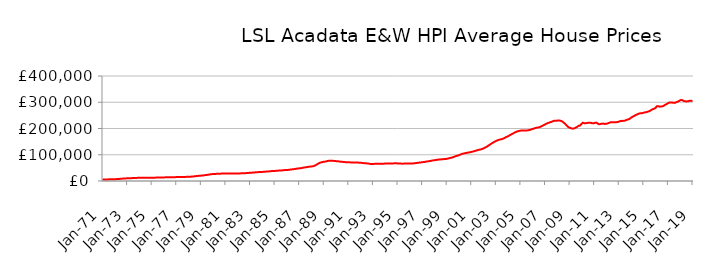
| Category | Series 0 |
|---|---|
| 1971-01-01 | 5778.581 |
| 1971-02-01 | 5819.644 |
| 1971-03-01 | 5861.052 |
| 1971-04-01 | 5914.887 |
| 1971-05-01 | 6004.226 |
| 1971-06-01 | 6097.324 |
| 1971-07-01 | 6211.806 |
| 1971-08-01 | 6336.376 |
| 1971-09-01 | 6459.952 |
| 1971-10-01 | 6588.334 |
| 1971-11-01 | 6726.925 |
| 1971-12-01 | 6895.683 |
| 1972-01-01 | 7012.816 |
| 1972-02-01 | 7089.505 |
| 1972-03-01 | 7264.068 |
| 1972-04-01 | 7508.171 |
| 1972-05-01 | 7860.864 |
| 1972-06-01 | 8170.355 |
| 1972-07-01 | 8526.19 |
| 1972-08-01 | 8869.45 |
| 1972-09-01 | 9172.546 |
| 1972-10-01 | 9455.81 |
| 1972-11-01 | 9718.109 |
| 1972-12-01 | 9988.703 |
| 1973-01-01 | 10182.281 |
| 1973-02-01 | 10319.059 |
| 1973-03-01 | 10476.299 |
| 1973-04-01 | 10655.658 |
| 1973-05-01 | 10885.617 |
| 1973-06-01 | 11035.023 |
| 1973-07-01 | 11191.497 |
| 1973-08-01 | 11365.076 |
| 1973-09-01 | 11567.646 |
| 1973-10-01 | 11777.671 |
| 1973-11-01 | 11937.725 |
| 1973-12-01 | 12052.498 |
| 1974-01-01 | 12114.056 |
| 1974-02-01 | 12180.401 |
| 1974-03-01 | 12177.683 |
| 1974-04-01 | 12151.396 |
| 1974-05-01 | 12128.2 |
| 1974-06-01 | 12129.044 |
| 1974-07-01 | 12140.839 |
| 1974-08-01 | 12180.432 |
| 1974-09-01 | 12252.457 |
| 1974-10-01 | 12340.928 |
| 1974-11-01 | 12414.246 |
| 1974-12-01 | 12486.63 |
| 1975-01-01 | 12520.118 |
| 1975-02-01 | 12562.362 |
| 1975-03-01 | 12637.333 |
| 1975-04-01 | 12744.087 |
| 1975-05-01 | 12873.689 |
| 1975-06-01 | 12943.075 |
| 1975-07-01 | 13011.113 |
| 1975-08-01 | 13105.055 |
| 1975-09-01 | 13232.189 |
| 1975-10-01 | 13373.438 |
| 1975-11-01 | 13497.805 |
| 1975-12-01 | 13630.81 |
| 1976-01-01 | 13724.455 |
| 1976-02-01 | 13812.644 |
| 1976-03-01 | 13872.986 |
| 1976-04-01 | 13937.169 |
| 1976-05-01 | 14021.143 |
| 1976-06-01 | 14076.084 |
| 1976-07-01 | 14136.858 |
| 1976-08-01 | 14226.8 |
| 1976-09-01 | 14355.517 |
| 1976-10-01 | 14500.583 |
| 1976-11-01 | 14616.658 |
| 1976-12-01 | 14720.316 |
| 1977-01-01 | 14777.952 |
| 1977-02-01 | 14844.144 |
| 1977-03-01 | 14887.065 |
| 1977-04-01 | 14937.409 |
| 1977-05-01 | 15015.166 |
| 1977-06-01 | 15085.676 |
| 1977-07-01 | 15172.371 |
| 1977-08-01 | 15291.274 |
| 1977-09-01 | 15436.686 |
| 1977-10-01 | 15600.493 |
| 1977-11-01 | 15773.788 |
| 1977-12-01 | 15999.984 |
| 1978-01-01 | 16167.959 |
| 1978-02-01 | 16299.061 |
| 1978-03-01 | 16475.734 |
| 1978-04-01 | 16713.402 |
| 1978-05-01 | 17094.413 |
| 1978-06-01 | 17479.975 |
| 1978-07-01 | 17946.292 |
| 1978-08-01 | 18424.608 |
| 1978-09-01 | 18884.941 |
| 1978-10-01 | 19342.68 |
| 1978-11-01 | 19769.516 |
| 1978-12-01 | 20191.255 |
| 1979-01-01 | 20442.13 |
| 1979-02-01 | 20610.397 |
| 1979-03-01 | 21029.54 |
| 1979-04-01 | 21604.081 |
| 1979-05-01 | 22337.281 |
| 1979-06-01 | 22802.563 |
| 1979-07-01 | 23285.495 |
| 1979-08-01 | 23829.32 |
| 1979-09-01 | 24480.85 |
| 1979-10-01 | 25176.324 |
| 1979-11-01 | 25755.381 |
| 1979-12-01 | 26205.315 |
| 1980-01-01 | 26452.337 |
| 1980-02-01 | 26644.34 |
| 1980-03-01 | 26890.696 |
| 1980-04-01 | 27179.161 |
| 1980-05-01 | 27516.6 |
| 1980-06-01 | 27697.106 |
| 1980-07-01 | 27860.786 |
| 1980-08-01 | 28012.05 |
| 1980-09-01 | 28118.706 |
| 1980-10-01 | 28187.005 |
| 1980-11-01 | 28239.499 |
| 1980-12-01 | 28351.177 |
| 1981-01-01 | 28417.565 |
| 1981-02-01 | 28518.272 |
| 1981-03-01 | 28619.251 |
| 1981-04-01 | 28754.782 |
| 1981-05-01 | 28892.195 |
| 1981-06-01 | 28938.816 |
| 1981-07-01 | 28961.048 |
| 1981-08-01 | 28966.541 |
| 1981-09-01 | 28911.984 |
| 1981-10-01 | 28812.42 |
| 1981-11-01 | 28721.014 |
| 1981-12-01 | 28711.063 |
| 1982-01-01 | 28666.699 |
| 1982-02-01 | 28686.129 |
| 1982-03-01 | 28845.213 |
| 1982-04-01 | 29113.24 |
| 1982-05-01 | 29413.475 |
| 1982-06-01 | 29523.039 |
| 1982-07-01 | 29605.704 |
| 1982-08-01 | 29763.338 |
| 1982-09-01 | 30018.943 |
| 1982-10-01 | 30322.622 |
| 1982-11-01 | 30625.169 |
| 1982-12-01 | 31000.37 |
| 1983-01-01 | 31285.472 |
| 1983-02-01 | 31530.496 |
| 1983-03-01 | 31785.806 |
| 1983-04-01 | 32102.207 |
| 1983-05-01 | 32517.182 |
| 1983-06-01 | 32842.832 |
| 1983-07-01 | 33197.41 |
| 1983-08-01 | 33534.274 |
| 1983-09-01 | 33803.554 |
| 1983-10-01 | 34023.857 |
| 1983-11-01 | 34231.746 |
| 1983-12-01 | 34504.784 |
| 1984-01-01 | 34667.972 |
| 1984-02-01 | 34833.654 |
| 1984-03-01 | 35148.221 |
| 1984-04-01 | 35584.586 |
| 1984-05-01 | 36084.097 |
| 1984-06-01 | 36305.56 |
| 1984-07-01 | 36490.904 |
| 1984-08-01 | 36773.294 |
| 1984-09-01 | 37223.913 |
| 1984-10-01 | 37745.264 |
| 1984-11-01 | 38148.207 |
| 1984-12-01 | 38428.254 |
| 1985-01-01 | 38505.993 |
| 1985-02-01 | 38613.431 |
| 1985-03-01 | 38877.562 |
| 1985-04-01 | 39248.564 |
| 1985-05-01 | 39672.187 |
| 1985-06-01 | 39835.893 |
| 1985-07-01 | 39987.238 |
| 1985-08-01 | 40249.596 |
| 1985-09-01 | 40687.139 |
| 1985-10-01 | 41186.844 |
| 1985-11-01 | 41606.839 |
| 1985-12-01 | 41942.748 |
| 1986-01-01 | 42073.314 |
| 1986-02-01 | 42206.626 |
| 1986-03-01 | 42596.037 |
| 1986-04-01 | 43159.332 |
| 1986-05-01 | 43862.389 |
| 1986-06-01 | 44288.034 |
| 1986-07-01 | 44723.162 |
| 1986-08-01 | 45242.601 |
| 1986-09-01 | 45895.474 |
| 1986-10-01 | 46600.536 |
| 1986-11-01 | 47240.523 |
| 1986-12-01 | 47837.225 |
| 1987-01-01 | 48183.417 |
| 1987-02-01 | 48470.067 |
| 1987-03-01 | 49091.843 |
| 1987-04-01 | 49929.002 |
| 1987-05-01 | 50929.272 |
| 1987-06-01 | 51493.685 |
| 1987-07-01 | 52033.634 |
| 1987-08-01 | 52627.858 |
| 1987-09-01 | 53272.878 |
| 1987-10-01 | 53940.591 |
| 1987-11-01 | 54566.177 |
| 1987-12-01 | 55214.165 |
| 1988-01-01 | 55522.204 |
| 1988-02-01 | 55787.875 |
| 1988-03-01 | 56717.064 |
| 1988-04-01 | 58115.424 |
| 1988-05-01 | 60219.447 |
| 1988-06-01 | 62342.579 |
| 1988-07-01 | 64842.518 |
| 1988-08-01 | 67142.158 |
| 1988-09-01 | 68912.875 |
| 1988-10-01 | 70383.082 |
| 1988-11-01 | 71565.513 |
| 1988-12-01 | 72615.333 |
| 1989-01-01 | 73164.108 |
| 1989-02-01 | 73628.044 |
| 1989-03-01 | 74415.491 |
| 1989-04-01 | 75418.057 |
| 1989-05-01 | 76480.197 |
| 1989-06-01 | 76944.266 |
| 1989-07-01 | 77260.226 |
| 1989-08-01 | 77408.357 |
| 1989-09-01 | 77280.652 |
| 1989-10-01 | 76923.296 |
| 1989-11-01 | 76447.889 |
| 1989-12-01 | 76060.406 |
| 1990-01-01 | 75711.661 |
| 1990-02-01 | 75697.35 |
| 1990-03-01 | 75177.716 |
| 1990-04-01 | 74503.281 |
| 1990-05-01 | 73714.687 |
| 1990-06-01 | 73338.383 |
| 1990-07-01 | 73017.722 |
| 1990-08-01 | 72705.168 |
| 1990-09-01 | 72265.957 |
| 1990-10-01 | 71763.936 |
| 1990-11-01 | 71298.016 |
| 1990-12-01 | 71100.097 |
| 1991-01-01 | 70960.966 |
| 1991-02-01 | 71035.522 |
| 1991-03-01 | 70922.586 |
| 1991-04-01 | 70847.983 |
| 1991-05-01 | 70749.789 |
| 1991-06-01 | 70705.845 |
| 1991-07-01 | 70659.152 |
| 1991-08-01 | 70593.649 |
| 1991-09-01 | 70481.53 |
| 1991-10-01 | 70280.97 |
| 1991-11-01 | 69952.468 |
| 1991-12-01 | 69605.033 |
| 1992-01-01 | 69260.927 |
| 1992-02-01 | 69208.159 |
| 1992-03-01 | 68725.479 |
| 1992-04-01 | 68142.872 |
| 1992-05-01 | 67499.75 |
| 1992-06-01 | 67289.23 |
| 1992-07-01 | 67137.867 |
| 1992-08-01 | 66820.205 |
| 1992-09-01 | 66142.2 |
| 1992-10-01 | 65300.935 |
| 1992-11-01 | 64730.656 |
| 1992-12-01 | 64747.256 |
| 1993-01-01 | 64907.444 |
| 1993-02-01 | 65190.915 |
| 1993-03-01 | 65445.628 |
| 1993-04-01 | 65764.278 |
| 1993-05-01 | 66035.947 |
| 1993-06-01 | 66067.024 |
| 1993-07-01 | 66086.68 |
| 1993-08-01 | 66141.094 |
| 1993-09-01 | 66099.7 |
| 1993-10-01 | 65980.598 |
| 1993-11-01 | 65902.66 |
| 1993-12-01 | 66133.369 |
| 1994-01-01 | 66450.741 |
| 1994-02-01 | 66846.387 |
| 1994-03-01 | 66831.306 |
| 1994-04-01 | 66669.989 |
| 1994-05-01 | 66528.32 |
| 1994-06-01 | 66541.018 |
| 1994-07-01 | 66620.973 |
| 1994-08-01 | 66785.42 |
| 1994-09-01 | 67046.807 |
| 1994-10-01 | 67363.476 |
| 1994-11-01 | 67513.346 |
| 1994-12-01 | 67424.931 |
| 1995-01-01 | 66930.878 |
| 1995-02-01 | 66505.588 |
| 1995-03-01 | 66345.676 |
| 1995-04-01 | 66179.05 |
| 1995-05-01 | 66207.277 |
| 1995-06-01 | 66066.819 |
| 1995-07-01 | 66210.834 |
| 1995-08-01 | 66274.799 |
| 1995-09-01 | 66312.623 |
| 1995-10-01 | 66288.853 |
| 1995-11-01 | 66372.439 |
| 1995-12-01 | 66453.866 |
| 1996-01-01 | 66477.973 |
| 1996-02-01 | 66437.524 |
| 1996-03-01 | 66657.047 |
| 1996-04-01 | 66916.11 |
| 1996-05-01 | 67408.306 |
| 1996-06-01 | 67768.61 |
| 1996-07-01 | 68356.993 |
| 1996-08-01 | 68926.287 |
| 1996-09-01 | 69501.463 |
| 1996-10-01 | 69920.266 |
| 1996-11-01 | 70364.299 |
| 1996-12-01 | 70992.181 |
| 1997-01-01 | 71442.548 |
| 1997-02-01 | 71922.337 |
| 1997-03-01 | 72332.117 |
| 1997-04-01 | 72997.168 |
| 1997-05-01 | 73865.854 |
| 1997-06-01 | 74525.484 |
| 1997-07-01 | 74991.174 |
| 1997-08-01 | 75733.483 |
| 1997-09-01 | 76397.622 |
| 1997-10-01 | 77257.824 |
| 1997-11-01 | 77859.322 |
| 1997-12-01 | 78623.228 |
| 1998-01-01 | 79076.436 |
| 1998-02-01 | 79757.021 |
| 1998-03-01 | 80350.699 |
| 1998-04-01 | 81087.745 |
| 1998-05-01 | 81611.316 |
| 1998-06-01 | 81932.97 |
| 1998-07-01 | 82318.136 |
| 1998-08-01 | 82678.536 |
| 1998-09-01 | 83043.331 |
| 1998-10-01 | 83285.382 |
| 1998-11-01 | 83567.784 |
| 1998-12-01 | 83907.289 |
| 1999-01-01 | 84409.798 |
| 1999-02-01 | 85413.4 |
| 1999-03-01 | 86298.095 |
| 1999-04-01 | 87175.742 |
| 1999-05-01 | 88136.841 |
| 1999-06-01 | 89153.578 |
| 1999-07-01 | 90350.574 |
| 1999-08-01 | 91899.847 |
| 1999-09-01 | 93479.148 |
| 1999-10-01 | 94930.187 |
| 1999-11-01 | 95915.47 |
| 1999-12-01 | 97238.882 |
| 2000-01-01 | 98294.329 |
| 2000-02-01 | 100197.041 |
| 2000-03-01 | 101690.591 |
| 2000-04-01 | 103282.864 |
| 2000-05-01 | 104088.993 |
| 2000-06-01 | 105077.236 |
| 2000-07-01 | 105958.897 |
| 2000-08-01 | 106780.43 |
| 2000-09-01 | 107543.252 |
| 2000-10-01 | 108326.838 |
| 2000-11-01 | 108972.225 |
| 2000-12-01 | 109793.944 |
| 2001-01-01 | 110459.623 |
| 2001-02-01 | 111492.415 |
| 2001-03-01 | 112458.562 |
| 2001-04-01 | 113645.435 |
| 2001-05-01 | 114925.837 |
| 2001-06-01 | 115987.247 |
| 2001-07-01 | 117144.994 |
| 2001-08-01 | 118298.968 |
| 2001-09-01 | 119344.038 |
| 2001-10-01 | 120045.574 |
| 2001-11-01 | 121242.557 |
| 2001-12-01 | 122568.557 |
| 2002-01-01 | 124340.102 |
| 2002-02-01 | 126061.259 |
| 2002-03-01 | 128117.853 |
| 2002-04-01 | 130332.251 |
| 2002-05-01 | 132832.459 |
| 2002-06-01 | 135364.654 |
| 2002-07-01 | 138137.358 |
| 2002-08-01 | 140600.564 |
| 2002-09-01 | 143214.854 |
| 2002-10-01 | 145663.243 |
| 2002-11-01 | 147814.065 |
| 2002-12-01 | 150182.316 |
| 2003-01-01 | 152294.778 |
| 2003-02-01 | 154028.719 |
| 2003-03-01 | 155430.273 |
| 2003-04-01 | 156771.149 |
| 2003-05-01 | 157909.301 |
| 2003-06-01 | 158824.35 |
| 2003-07-01 | 159630.876 |
| 2003-08-01 | 161216.586 |
| 2003-09-01 | 162872.54 |
| 2003-10-01 | 165036.958 |
| 2003-11-01 | 167138.204 |
| 2003-12-01 | 168897.979 |
| 2004-01-01 | 170648.086 |
| 2004-02-01 | 172981.66 |
| 2004-03-01 | 175255.438 |
| 2004-04-01 | 177312.932 |
| 2004-05-01 | 179520.856 |
| 2004-06-01 | 181595.895 |
| 2004-07-01 | 183588.803 |
| 2004-08-01 | 185637.75 |
| 2004-09-01 | 187263.331 |
| 2004-10-01 | 188949.471 |
| 2004-11-01 | 189891.62 |
| 2004-12-01 | 190886.386 |
| 2005-01-01 | 191651.97 |
| 2005-02-01 | 192756.957 |
| 2005-03-01 | 192653.94 |
| 2005-04-01 | 192730.932 |
| 2005-05-01 | 192129.499 |
| 2005-06-01 | 192629.137 |
| 2005-07-01 | 192637.159 |
| 2005-08-01 | 192884.354 |
| 2005-09-01 | 193456.443 |
| 2005-10-01 | 194586.143 |
| 2005-11-01 | 195531.81 |
| 2005-12-01 | 197150.584 |
| 2006-01-01 | 198153.754 |
| 2006-02-01 | 199813.466 |
| 2006-03-01 | 200983.99 |
| 2006-04-01 | 202245.961 |
| 2006-05-01 | 203065.042 |
| 2006-06-01 | 203685.673 |
| 2006-07-01 | 204559.278 |
| 2006-08-01 | 205714.078 |
| 2006-09-01 | 207431.746 |
| 2006-10-01 | 209492.23 |
| 2006-11-01 | 211163.513 |
| 2006-12-01 | 213373.811 |
| 2007-01-01 | 215210.655 |
| 2007-02-01 | 217819.553 |
| 2007-03-01 | 219232.983 |
| 2007-04-01 | 221043.784 |
| 2007-05-01 | 222128.218 |
| 2007-06-01 | 223865.002 |
| 2007-07-01 | 224582.145 |
| 2007-08-01 | 226402.251 |
| 2007-09-01 | 228182.408 |
| 2007-10-01 | 229491.543 |
| 2007-11-01 | 229231.088 |
| 2007-12-01 | 229404.46 |
| 2008-01-01 | 229854.007 |
| 2008-02-01 | 230778.597 |
| 2008-03-01 | 230153.08 |
| 2008-04-01 | 229721.005 |
| 2008-05-01 | 228299.829 |
| 2008-06-01 | 226513.482 |
| 2008-07-01 | 223227.056 |
| 2008-08-01 | 220141.088 |
| 2008-09-01 | 216463.272 |
| 2008-10-01 | 212510.657 |
| 2008-11-01 | 207922.628 |
| 2008-12-01 | 204675.242 |
| 2009-01-01 | 203165.33 |
| 2009-02-01 | 201911.844 |
| 2009-03-01 | 200225.813 |
| 2009-04-01 | 199383.576 |
| 2009-05-01 | 199859.253 |
| 2009-06-01 | 201412.925 |
| 2009-07-01 | 203027.61 |
| 2009-08-01 | 205323.71 |
| 2009-09-01 | 208069.093 |
| 2009-10-01 | 210492.42 |
| 2009-11-01 | 210907.6 |
| 2009-12-01 | 215086.622 |
| 2010-01-01 | 218354.797 |
| 2010-02-01 | 222015.55 |
| 2010-03-01 | 220623.663 |
| 2010-04-01 | 219905.901 |
| 2010-05-01 | 220113.626 |
| 2010-06-01 | 220921.717 |
| 2010-07-01 | 221564.916 |
| 2010-08-01 | 222318.029 |
| 2010-09-01 | 222269.425 |
| 2010-10-01 | 221434.684 |
| 2010-11-01 | 219854.924 |
| 2010-12-01 | 219866.03 |
| 2011-01-01 | 220405.999 |
| 2011-02-01 | 222145.885 |
| 2011-03-01 | 222431.145 |
| 2011-04-01 | 220277.333 |
| 2011-05-01 | 217364.071 |
| 2011-06-01 | 215781.529 |
| 2011-07-01 | 216886.961 |
| 2011-08-01 | 218462.386 |
| 2011-09-01 | 218447.96 |
| 2011-10-01 | 218746.451 |
| 2011-11-01 | 217505.539 |
| 2011-12-01 | 217590.911 |
| 2012-01-01 | 218300.924 |
| 2012-02-01 | 219064.04 |
| 2012-03-01 | 220982.893 |
| 2012-04-01 | 221888.073 |
| 2012-05-01 | 224080.255 |
| 2012-06-01 | 224094.767 |
| 2012-07-01 | 223904.739 |
| 2012-08-01 | 223391.425 |
| 2012-09-01 | 223676.621 |
| 2012-10-01 | 224076.65 |
| 2012-11-01 | 224222.02 |
| 2012-12-01 | 224932.069 |
| 2013-01-01 | 225725.691 |
| 2013-02-01 | 227657.684 |
| 2013-03-01 | 228536.318 |
| 2013-04-01 | 229161.736 |
| 2013-05-01 | 228933.746 |
| 2013-06-01 | 229215.618 |
| 2013-07-01 | 230067.874 |
| 2013-08-01 | 231582.352 |
| 2013-09-01 | 233071.269 |
| 2013-10-01 | 234544.706 |
| 2013-11-01 | 235649.654 |
| 2013-12-01 | 237829.132 |
| 2014-01-01 | 241172.518 |
| 2014-02-01 | 243555.901 |
| 2014-03-01 | 246091.044 |
| 2014-04-01 | 247497.872 |
| 2014-05-01 | 250020.497 |
| 2014-06-01 | 252131.969 |
| 2014-07-01 | 253728.94 |
| 2014-08-01 | 255600.623 |
| 2014-09-01 | 257111.229 |
| 2014-10-01 | 258073.581 |
| 2014-11-01 | 258087.083 |
| 2014-12-01 | 258355.146 |
| 2015-01-01 | 259818.582 |
| 2015-02-01 | 261058.597 |
| 2015-03-01 | 261701.1 |
| 2015-04-01 | 262401.663 |
| 2015-05-01 | 263522.572 |
| 2015-06-01 | 265038.057 |
| 2015-07-01 | 266149.558 |
| 2015-08-01 | 268751.273 |
| 2015-09-01 | 270772.804 |
| 2015-10-01 | 273642.208 |
| 2015-11-01 | 274283.861 |
| 2015-12-01 | 276419.926 |
| 2016-01-01 | 278666.894 |
| 2016-02-01 | 284429.326 |
| 2016-03-01 | 284960.108 |
| 2016-04-01 | 284944.646 |
| 2016-05-01 | 282948.008 |
| 2016-06-01 | 283814.098 |
| 2016-07-01 | 284190.963 |
| 2016-08-01 | 285049.367 |
| 2016-09-01 | 286912.583 |
| 2016-10-01 | 289670.712 |
| 2016-11-01 | 291498.925 |
| 2016-12-01 | 293660.7 |
| 2017-01-01 | 296049.21 |
| 2017-02-01 | 297926.736 |
| 2017-03-01 | 299530.686 |
| 2017-04-01 | 299443.554 |
| 2017-05-01 | 299198.045 |
| 2017-06-01 | 297889.012 |
| 2017-07-01 | 297586.573 |
| 2017-08-01 | 297952.018 |
| 2017-09-01 | 299921.147 |
| 2017-10-01 | 301478 |
| 2017-11-01 | 302835.922 |
| 2017-12-01 | 304972.766 |
| 2018-01-01 | 307457.823 |
| 2018-02-01 | 308916.673 |
| 2018-03-01 | 307949.622 |
| 2018-04-01 | 305866.154 |
| 2018-05-01 | 304349.104 |
| 2018-06-01 | 303858.588 |
| 2018-07-01 | 303058.633 |
| 2018-08-01 | 303604.417 |
| 2018-09-01 | 303917.53 |
| 2018-10-01 | 305760.933 |
| 2018-11-01 | 305579.093 |
| 2018-12-01 | 305283.604 |
| 2019-01-01 | 304739.195 |